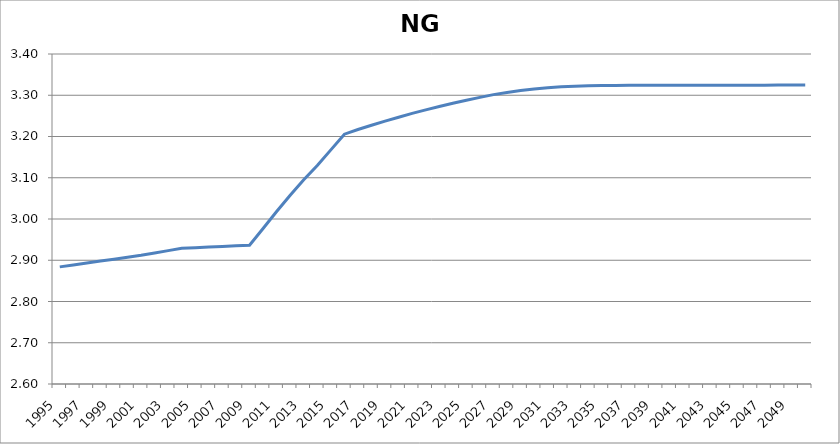
| Category | NGDryer |
|---|---|
| 1995.0 | 2.884 |
| 1996.0 | 2.889 |
| 1997.0 | 2.893 |
| 1998.0 | 2.898 |
| 1999.0 | 2.903 |
| 2000.0 | 2.907 |
| 2001.0 | 2.912 |
| 2002.0 | 2.918 |
| 2003.0 | 2.923 |
| 2004.0 | 2.929 |
| 2005.0 | 2.93 |
| 2006.0 | 2.932 |
| 2007.0 | 2.933 |
| 2008.0 | 2.935 |
| 2009.0 | 2.936 |
| 2010.0 | 2.977 |
| 2011.0 | 3.018 |
| 2012.0 | 3.058 |
| 2013.0 | 3.095 |
| 2014.0 | 3.13 |
| 2015.0 | 3.168 |
| 2016.0 | 3.206 |
| 2017.0 | 3.217 |
| 2018.0 | 3.227 |
| 2019.0 | 3.237 |
| 2020.0 | 3.247 |
| 2021.0 | 3.256 |
| 2022.0 | 3.265 |
| 2023.0 | 3.273 |
| 2024.0 | 3.281 |
| 2025.0 | 3.288 |
| 2026.0 | 3.295 |
| 2027.0 | 3.301 |
| 2028.0 | 3.307 |
| 2029.0 | 3.311 |
| 2030.0 | 3.315 |
| 2031.0 | 3.318 |
| 2032.0 | 3.32 |
| 2033.0 | 3.322 |
| 2034.0 | 3.323 |
| 2035.0 | 3.324 |
| 2036.0 | 3.324 |
| 2037.0 | 3.324 |
| 2038.0 | 3.324 |
| 2039.0 | 3.324 |
| 2040.0 | 3.324 |
| 2041.0 | 3.324 |
| 2042.0 | 3.324 |
| 2043.0 | 3.324 |
| 2044.0 | 3.324 |
| 2045.0 | 3.324 |
| 2046.0 | 3.324 |
| 2047.0 | 3.325 |
| 2048.0 | 3.325 |
| 2049.0 | 3.325 |
| 2050.0 | 3.325 |